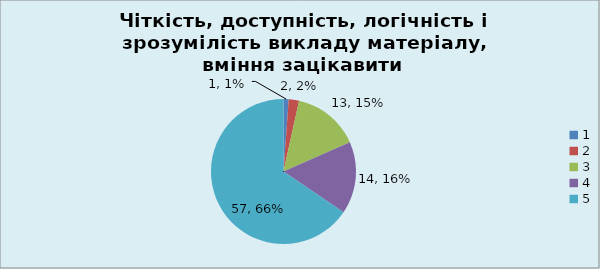
| Category | Кількість | % |
|---|---|---|
| 0 | 1 | 0.011 |
| 1 | 2 | 0.023 |
| 2 | 13 | 0.149 |
| 3 | 14 | 0.161 |
| 4 | 57 | 0.655 |